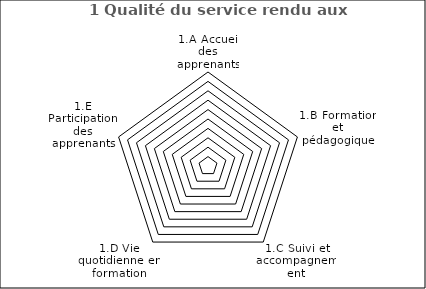
| Category | 1 Qualité du service rendu aux apprenants |
|---|---|
| 1.A Accueil des apprenants | 0 |
| 1.B Formation et pédagogique | 0 |
| 1.C Suivi et accompagnement | 0 |
| 1.D Vie quotidienne en formation | 0 |
| 1.E Participation des apprenants | 0 |